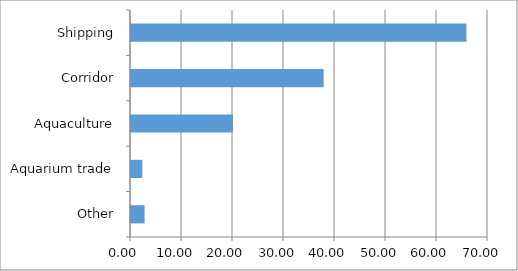
| Category | Series 0 |
|---|---|
| Other | 2.667 |
| Aquarium trade | 2.222 |
| Aquaculture | 20 |
| Corridor | 37.778 |
| Shipping | 65.778 |